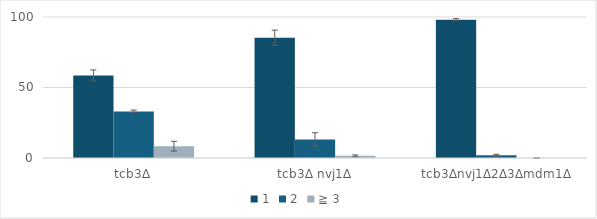
| Category | 1 | 2 | ≧ 3 |
|---|---|---|---|
| tcb3∆ | 58.558 | 33.063 | 8.379 |
| tcb3∆ nvj1∆ | 85.31 | 13.14 | 1.55 |
| tcb3∆nvj1∆2∆3∆mdm1∆ | 98.117 | 1.883 | 0 |